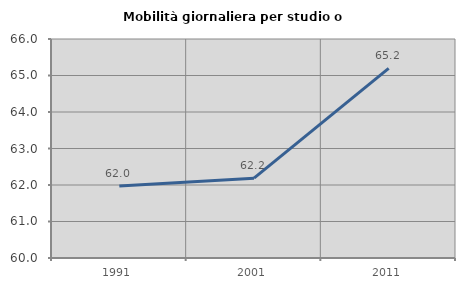
| Category | Mobilità giornaliera per studio o lavoro |
|---|---|
| 1991.0 | 61.976 |
| 2001.0 | 62.187 |
| 2011.0 | 65.195 |